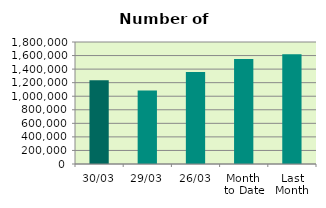
| Category | Series 0 |
|---|---|
| 30/03 | 1236166 |
| 29/03 | 1082976 |
| 26/03 | 1358352 |
| Month 
to Date | 1547420.636 |
| Last
Month | 1618522.4 |